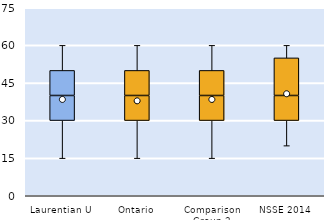
| Category | 25th | 50th | 75th |
|---|---|---|---|
| Laurentian U | 30 | 10 | 10 |
| Ontario | 30 | 10 | 10 |
| Comparison Group 2 | 30 | 10 | 10 |
| NSSE 2014 | 30 | 10 | 15 |